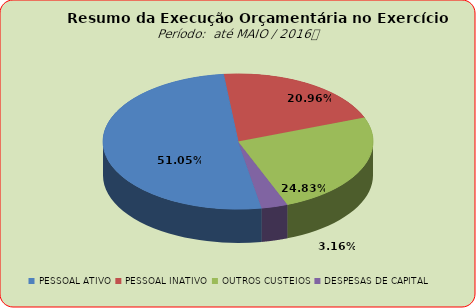
| Category | Series 0 |
|---|---|
| PESSOAL ATIVO | 53981299.34 |
| PESSOAL INATIVO | 22159651.67 |
| OUTROS CUSTEIOS | 26253753.24 |
| DESPESAS DE CAPITAL | 3343835.38 |